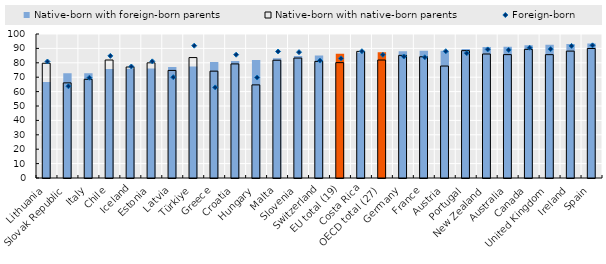
| Category | Native-born with foreign-born parents | Native-born with native-born parents |
|---|---|---|
| Lithuania | 66.716 | 79.689 |
| Slovak Republic | 72.698 | 66.068 |
| Italy | 72.712 | 68.545 |
| Chile | 75.627 | 81.943 |
| Iceland | 75.917 | 77.094 |
| Estonia | 76.064 | 79.98 |
| Latvia | 77.019 | 74.698 |
| Türkiye | 77.465 | 83.633 |
| Greece | 80.583 | 74.198 |
| Croatia | 81.223 | 79.228 |
| Hungary | 81.872 | 64.664 |
| Malta | 83.217 | 81.787 |
| Slovenia | 84.668 | 83.281 |
| Switzerland | 85.011 | 80.967 |
| EU total (19) | 86.26 | 80.128 |
| Costa Rica | 87.119 | 87.92 |
| OECD total (27) | 87.298 | 81.928 |
| Germany | 88.026 | 85.166 |
| France | 88.345 | 84.18 |
| Austria | 88.365 | 77.753 |
| Portugal | 89.652 | 88.441 |
| New Zealand | 90.987 | 86.106 |
| Australia | 91.103 | 85.68 |
| Canada | 92.209 | 89.342 |
| United Kingdom | 92.561 | 85.66 |
| Ireland | 92.986 | 88.116 |
| Spain | 93.458 | 89.929 |